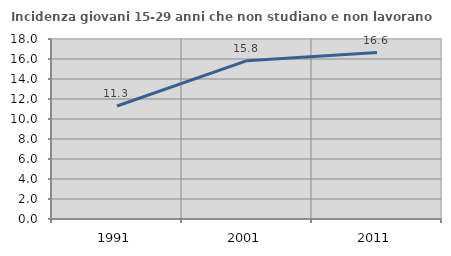
| Category | Incidenza giovani 15-29 anni che non studiano e non lavorano  |
|---|---|
| 1991.0 | 11.296 |
| 2001.0 | 15.835 |
| 2011.0 | 16.64 |